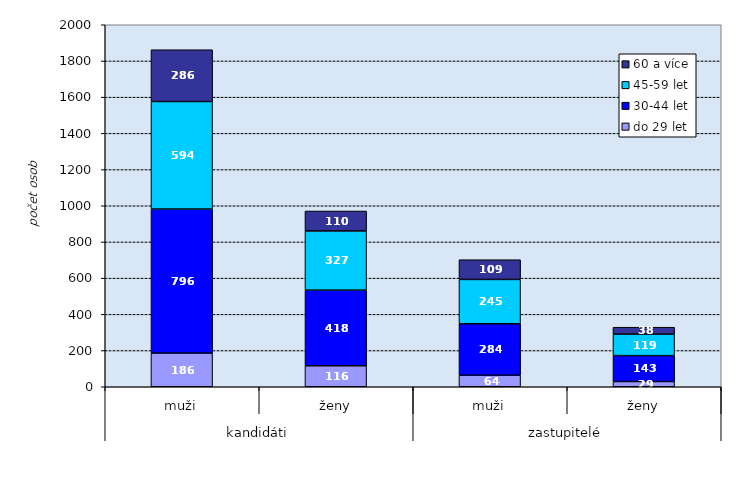
| Category | do 29 let | 30-44 let | 45-59 let | 60 a více |
|---|---|---|---|---|
| 0 | 186 | 796 | 594 | 286 |
| 1 | 116 | 418 | 327 | 110 |
| 2 | 64 | 284 | 245 | 109 |
| 3 | 29 | 143 | 119 | 38 |